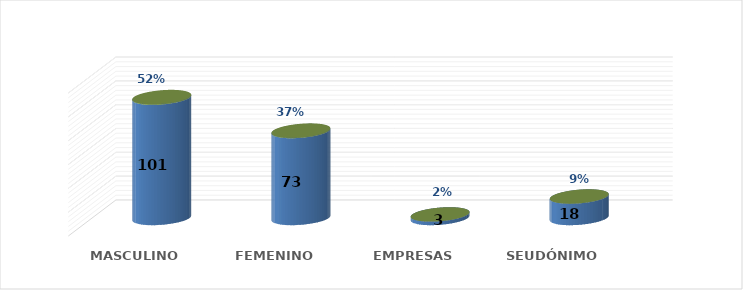
| Category | SOLICITUD POR GÉNERO | Series 1 |
|---|---|---|
| MASCULINO | 101 | 0.518 |
| FEMENINO | 73 | 0.374 |
| EMPRESAS | 3 | 0.015 |
| SEUDÓNIMO | 18 | 0.092 |